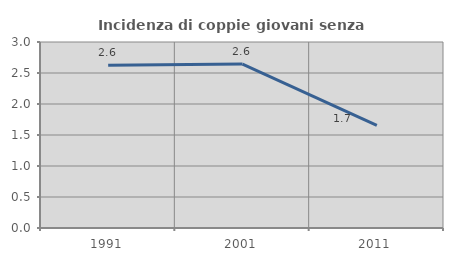
| Category | Incidenza di coppie giovani senza figli |
|---|---|
| 1991.0 | 2.625 |
| 2001.0 | 2.644 |
| 2011.0 | 1.657 |